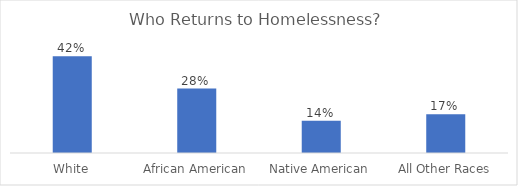
| Category | Series 0 |
|---|---|
| White | 0.417 |
| African American | 0.278 |
| Native American | 0.139 |
| All Other Races | 0.167 |